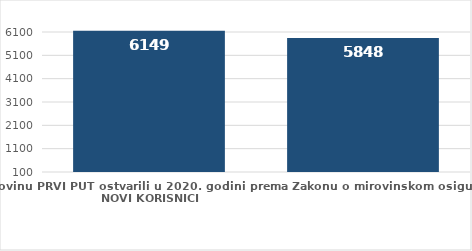
| Category | broj korisnika |
|---|---|
| Korisnici koji su pravo na mirovinu PRVI PUT ostvarili u 2020. godini prema Zakonu o mirovinskom osiguranju - NOVI KORISNICI | 6149 |
| Korisnici mirovina kojima je u 2020. godini PRESTALO PRAVO NA MIROVINU - uzrok smrt 
koji su pravo na mirovinu ostvarili prema Zakonu o mirovinskom osiguranju | 5848 |